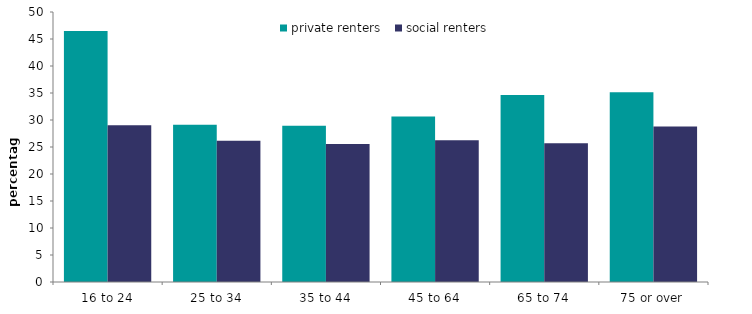
| Category | private renters | social renters |
|---|---|---|
| 16 to 24 | 46.493 | 29.034 |
| 25 to 34 | 29.13 | 26.169 |
| 35 to 44 | 28.936 | 25.533 |
| 45 to 64 | 30.658 | 26.234 |
| 65 to 74 | 34.614 | 25.694 |
| 75 or over | 35.117 | 28.785 |